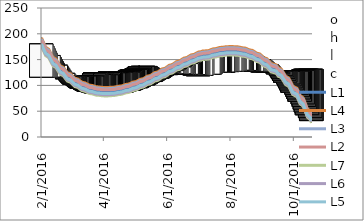
| Category | o | h | l | c |
|---|---|---|---|---|
| 18/10/2016 | 131.1 | 131.5 | 131 | 131.5 |
| 17/10/2016 | 131.1 | 131.9 | 131.1 | 131.5 |
| 14/10/2016 | 131 | 131.4 | 131 | 131.2 |
| 13/10/2016 | 131.2 | 131.5 | 131 | 131.5 |
| 12/10/2016 | 131.1 | 131.5 | 131 | 131 |
| 11/10/2016 | 130.65 | 132 | 130.65 | 131.1 |
| 10/10/2016 | 129.15 | 130.65 | 129.15 | 130.65 |
| 07/10/2016 | 128.1 | 129.15 | 128.1 | 129.15 |
| 06/10/2016 | 128 | 128.25 | 128 | 128.05 |
| 05/10/2016 | 127.25 | 128 | 127.25 | 128 |
| 04/10/2016 | 127.55 | 127.9 | 127.5 | 127.5 |
| 30/09/2016 | 127.5 | 127.95 | 127.15 | 127.55 |
| 29/09/2016 | 127 | 127.95 | 127 | 127.95 |
| 28/09/2016 | 127.5 | 127.5 | 126.9 | 126.9 |
| 27/09/2016 | 127 | 127 | 126.65 | 127 |
| 26/09/2016 | 127.25 | 127.95 | 127 | 127 |
| 23/09/2016 | 127.3 | 127.5 | 127.25 | 127.5 |
| 22/09/2016 | 127 | 127.5 | 127 | 127.5 |
| 21/09/2016 | 127.75 | 127.75 | 127 | 127 |
| 20/09/2016 | 127.15 | 127.15 | 127 | 127 |
| 19/09/2016 | 127.5 | 127.75 | 127.2 | 127.2 |
| 16/09/2016 | 127.55 | 127.8 | 127.1 | 127.25 |
| 15/09/2016 | 127.75 | 128 | 127.75 | 127.8 |
| 14/09/2016 | 128.1 | 128.1 | 127.65 | 127.8 |
| 09/09/2016 | 128 | 128.3 | 128 | 128.05 |
| 08/09/2016 | 127.9 | 128.15 | 127.5 | 128 |
| 07/09/2016 | 127.2 | 127.85 | 127.2 | 127.8 |
| 06/09/2016 | 126.45 | 127.45 | 126.45 | 127.45 |
| 05/09/2016 | 127.3 | 127.3 | 126.45 | 126.45 |
| 02/09/2016 | 126.5 | 127 | 126.5 | 126.75 |
| 01/09/2016 | 126.25 | 126.75 | 126.25 | 126.75 |
| 31/08/2016 | 127 | 127 | 126.5 | 126.5 |
| 30/08/2016 | 127.3 | 127.3 | 126.8 | 127 |
| 29/08/2016 | 127.4 | 127.4 | 127 | 127 |
| 26/08/2016 | 127 | 127.35 | 126.8 | 127.3 |
| 25/08/2016 | 127.3 | 127.3 | 126.9 | 127.3 |
| 24/08/2016 | 127.4 | 127.4 | 126.5 | 127.4 |
| 23/08/2016 | 127.5 | 127.5 | 126.7 | 126.75 |
| 22/08/2016 | 127.25 | 127.3 | 126.95 | 126.95 |
| 19/08/2016 | 128.15 | 128.15 | 127.5 | 127.5 |
| 18/08/2016 | 129 | 129 | 128.75 | 128.75 |
| 17/08/2016 | 129 | 129.25 | 128.75 | 129.25 |
| 16/08/2016 | 129 | 129.5 | 129 | 129 |
| 15/08/2016 | 129 | 129.5 | 129 | 129 |
| 12/08/2016 | 129.5 | 129.5 | 129 | 129 |
| 11/08/2016 | 129 | 129.65 | 129 | 129.65 |
| 10/08/2016 | 129 | 129.5 | 129 | 129.05 |
| 09/08/2016 | 129 | 129.75 | 129 | 129 |
| 08/08/2016 | 129.5 | 129.7 | 129.2 | 129.7 |
| 05/08/2016 | 128.65 | 129.5 | 128.65 | 129.5 |
| 04/08/2016 | 128.8 | 128.85 | 128.6 | 128.6 |
| 03/08/2016 | 127.85 | 128.5 | 127.7 | 128.5 |
| 02/08/2016 | 127.2 | 128 | 127.2 | 127.65 |
| 01/08/2016 | 127.4 | 127.4 | 127 | 127.2 |
| 29/07/2016 | 126.8 | 127.25 | 126.8 | 127.25 |
| 28/07/2016 | 127 | 127.25 | 126.55 | 127.1 |
| 27/07/2016 | 127.4 | 127.4 | 126.6 | 127.2 |
| 26/07/2016 | 126.75 | 127.4 | 126.75 | 127 |
| 25/07/2016 | 126 | 127.2 | 126 | 127 |
| 22/07/2016 | 126 | 126 | 125.65 | 126 |
| 21/07/2016 | 125.5 | 126 | 125.5 | 126 |
| 20/07/2016 | 125.7 | 125.7 | 125.5 | 125.65 |
| 19/07/2016 | 125.5 | 126 | 125.5 | 126 |
| 18/07/2016 | 125.8 | 126.5 | 125.7 | 125.75 |
| 15/07/2016 | 126.5 | 127 | 125.75 | 125.75 |
| 14/07/2016 | 125 | 127.05 | 125 | 127 |
| 13/07/2016 | 123.55 | 125 | 123.55 | 124.65 |
| 12/07/2016 | 121.7 | 124 | 121.7 | 124 |
| 11/07/2016 | 121.7 | 121.85 | 121.5 | 121.85 |
| 05/07/2016 | 121 | 121.7 | 121 | 121.7 |
| 04/07/2016 | 119.5 | 121.4 | 119.5 | 121.4 |
| 01/07/2016 | 118.75 | 120 | 118.75 | 120 |
| 30/06/2016 | 119.95 | 119.95 | 118.75 | 118.75 |
| 29/06/2016 | 120 | 120 | 119.75 | 119.95 |
| 28/06/2016 | 120 | 120.35 | 119.75 | 120.35 |
| 27/06/2016 | 121 | 121 | 120 | 120 |
| 24/06/2016 | 121.15 | 121.5 | 121.15 | 121.2 |
| 23/06/2016 | 121.1 | 121.15 | 121 | 121.15 |
| 22/06/2016 | 121.4 | 121.85 | 121.15 | 121.15 |
| 21/06/2016 | 121.5 | 121.5 | 121.1 | 121.25 |
| 20/06/2016 | 121.55 | 122 | 121.2 | 121.2 |
| 17/06/2016 | 121.5 | 122.6 | 121.5 | 121.55 |
| 16/06/2016 | 122.8 | 122.8 | 121.5 | 121.5 |
| 15/06/2016 | 121.6 | 123 | 121.6 | 122.8 |
| 14/06/2016 | 122.2 | 122.2 | 121.5 | 122 |
| 13/06/2016 | 122.65 | 123.45 | 122.45 | 122.45 |
| 10/06/2016 | 122.65 | 123 | 122.65 | 123 |
| 09/06/2016 | 122.5 | 123 | 122.5 | 122.6 |
| 08/06/2016 | 122.85 | 122.95 | 122.5 | 122.5 |
| 07/06/2016 | 122.7 | 124.7 | 122.7 | 122.75 |
| 06/06/2016 | 122.75 | 124 | 122.65 | 122.7 |
| 03/06/2016 | 123 | 124 | 122.5 | 122.75 |
| 02/06/2016 | 122.8 | 125 | 122.6 | 123 |
| 01/06/2016 | 122.5 | 123.5 | 122.5 | 122.55 |
| 31/05/2016 | 122.9 | 124 | 122.75 | 122.9 |
| 30/05/2016 | 123.85 | 123.85 | 122.5 | 122.9 |
| 27/05/2016 | 121.75 | 123.4 | 121.75 | 122.9 |
| 26/05/2016 | 122 | 122 | 121.6 | 121.75 |
| 25/05/2016 | 122.8 | 122.8 | 121.8 | 121.9 |
| 24/05/2016 | 123.6 | 126.4 | 122.8 | 122.8 |
| 23/05/2016 | 130 | 131.1 | 130 | 130 |
| 20/05/2016 | 130 | 131.8 | 130 | 131.15 |
| 19/05/2016 | 130 | 130.05 | 128.5 | 130 |
| 18/05/2016 | 129.1 | 130 | 128 | 129.1 |
| 17/05/2016 | 131.05 | 131.05 | 130 | 130 |
| 16/05/2016 | 131.1 | 131.7 | 130.55 | 131.55 |
| 13/05/2016 | 134 | 134 | 130.15 | 132 |
| 12/05/2016 | 135 | 135.5 | 134.3 | 134.5 |
| 11/05/2016 | 136.7 | 136.7 | 135.5 | 135.85 |
| 10/05/2016 | 136 | 136.95 | 136 | 136.2 |
| 09/05/2016 | 137 | 137 | 136.05 | 136.7 |
| 06/05/2016 | 136 | 137 | 136 | 136.3 |
| 05/05/2016 | 133.6 | 138.45 | 133.6 | 135.6 |
| 04/05/2016 | 133 | 133.5 | 132.55 | 133.4 |
| 03/05/2016 | 132 | 132.8 | 132 | 132.55 |
| 02/05/2016 | 131 | 132.5 | 130.5 | 132.5 |
| 29/04/2016 | 129.75 | 132.5 | 129.6 | 132.5 |
| 28/04/2016 | 129.6 | 130 | 129.55 | 129.9 |
| 27/04/2016 | 129 | 130 | 128.65 | 129.6 |
| 26/04/2016 | 127.25 | 129 | 127 | 129 |
| 25/04/2016 | 125.6 | 127.2 | 125.6 | 127 |
| 22/04/2016 | 125.5 | 125.5 | 125.1 | 125.5 |
| 21/04/2016 | 126 | 126 | 125.4 | 125.55 |
| 20/04/2016 | 126.25 | 126.25 | 125.75 | 125.75 |
| 19/04/2016 | 125.8 | 126.05 | 125.8 | 126 |
| 18/04/2016 | 125.55 | 126 | 125.1 | 126 |
| 15/04/2016 | 124.5 | 126 | 124.5 | 126 |
| 14/04/2016 | 124.5 | 124.8 | 124.05 | 124.6 |
| 13/04/2016 | 124 | 124.25 | 123.55 | 124.05 |
| 12/04/2016 | 124 | 124.05 | 123.55 | 124 |
| 11/04/2016 | 124.3 | 124.5 | 123.75 | 124.5 |
| 08/04/2016 | 125.3 | 125.3 | 124 | 124.5 |
| 07/04/2016 | 126 | 126.4 | 124.75 | 125.3 |
| 06/04/2016 | 125 | 126.9 | 125 | 126 |
| 05/04/2016 | 122.05 | 125.5 | 122.05 | 124.5 |
| 04/04/2016 | 120.5 | 123 | 120.5 | 122.05 |
| 01/04/2016 | 120.2 | 120.35 | 120.2 | 120.3 |
| 31/03/2016 | 121.8 | 121.8 | 120 | 120.2 |
| 30/03/2016 | 120.65 | 120.65 | 119.5 | 119.65 |
| 29/03/2016 | 120.05 | 120.05 | 119 | 119.65 |
| 28/03/2016 | 121.2 | 121.25 | 120.95 | 121 |
| 25/03/2016 | 123.85 | 123.85 | 121.2 | 121.2 |
| 24/03/2016 | 125 | 125 | 122.2 | 123.85 |
| 23/03/2016 | 122.5 | 124.8 | 122 | 124.8 |
| 22/03/2016 | 118.5 | 123.4 | 118.45 | 122 |
| 21/03/2016 | 118 | 119 | 118 | 118.45 |
| 18/03/2016 | 118.05 | 118.4 | 118.05 | 118.4 |
| 17/03/2016 | 118 | 118.3 | 117.8 | 118.3 |
| 16/03/2016 | 118 | 118.4 | 118 | 118 |
| 15/03/2016 | 118.3 | 118.3 | 117.9 | 118.2 |
| 14/03/2016 | 118.05 | 118.5 | 118.05 | 118.2 |
| 11/03/2016 | 118.05 | 118.9 | 118.05 | 118.25 |
| 10/03/2016 | 117.25 | 118.5 | 117.25 | 118.5 |
| 09/03/2016 | 117.75 | 117.8 | 117.25 | 117.6 |
| 08/03/2016 | 117.55 | 118 | 117.55 | 117.9 |
| 07/03/2016 | 117.5 | 117.8 | 117 | 117.8 |
| 04/03/2016 | 117.3 | 117.5 | 117 | 117 |
| 03/03/2016 | 118 | 118 | 117.1 | 117.5 |
| 02/03/2016 | 115.7 | 117 | 115.7 | 117 |
| 01/03/2016 | 115.1 | 116.9 | 115 | 115.65 |
| 29/02/2016 | 117.9 | 117.9 | 114.5 | 115.6 |
| 26/02/2016 | 117.85 | 118 | 117 | 117.5 |
| 25/02/2016 | 118.65 | 118.65 | 118 | 118.25 |
| 24/02/2016 | 118.65 | 118.8 | 118.65 | 118.8 |
| 23/02/2016 | 119 | 119 | 118.6 | 118.9 |
| 22/02/2016 | 119 | 119.05 | 118.8 | 119.05 |
| 19/02/2016 | 118.45 | 119.8 | 118.1 | 119.4 |
| 18/02/2016 | 117.9 | 118.4 | 117.8 | 118.3 |
| 17/02/2016 | 119.25 | 119.65 | 118.25 | 118.25 |
| 16/02/2016 | 117 | 119.5 | 117 | 119.5 |
| 15/02/2016 | 116.5 | 117.45 | 116.5 | 117 |
| 12/02/2016 | 116.35 | 116.65 | 116.25 | 116.25 |
| 11/02/2016 | 116.25 | 116.45 | 116.1 | 116.25 |
| 10/02/2016 | 116 | 116.25 | 116 | 116.25 |
| 09/02/2016 | 116 | 116.45 | 116 | 116 |
| 08/02/2016 | 116.15 | 116.45 | 116 | 116 |
| 05/02/2016 | 116 | 116.15 | 115.85 | 116.15 |
| 04/02/2016 | 115.8 | 116.5 | 115.8 | 116.5 |
| 03/02/2016 | 116 | 116 | 115.65 | 115.8 |
| 02/02/2016 | 115.5 | 116.05 | 115.4 | 116.05 |
| 01/02/2016 | 115.95 | 115.95 | 115.4 | 115.4 |